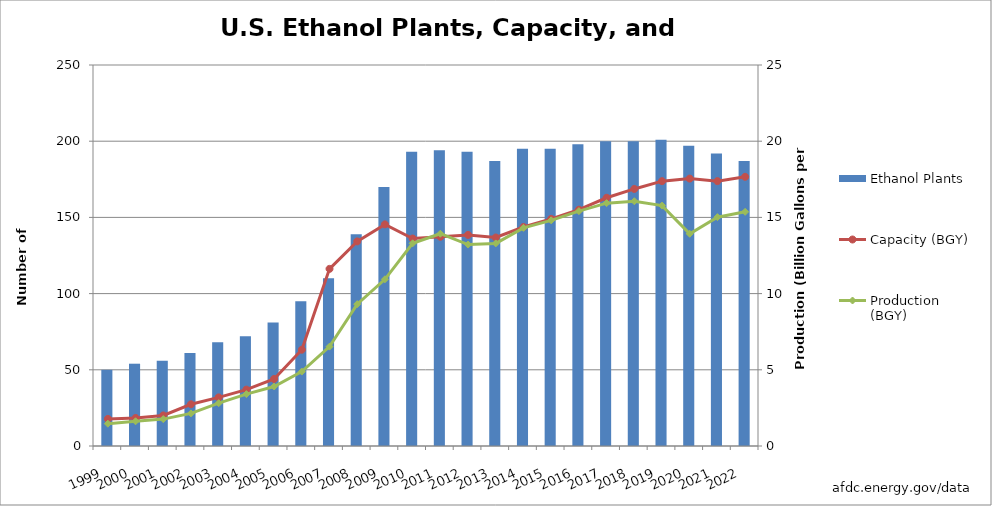
| Category | Ethanol Plants |
|---|---|
| 1999.0 | 50 |
| 2000.0 | 54 |
| 2001.0 | 56 |
| 2002.0 | 61 |
| 2003.0 | 68 |
| 2004.0 | 72 |
| 2005.0 | 81 |
| 2006.0 | 95 |
| 2007.0 | 110 |
| 2008.0 | 139 |
| 2009.0 | 170 |
| 2010.0 | 193 |
| 2011.0 | 194 |
| 2012.0 | 193 |
| 2013.0 | 187 |
| 2014.0 | 195 |
| 2015.0 | 195 |
| 2016.0 | 198 |
| 2017.0 | 200 |
| 2018.0 | 200 |
| 2019.0 | 201 |
| 2020.0 | 197 |
| 2021.0 | 192 |
| 2022.0 | 187 |